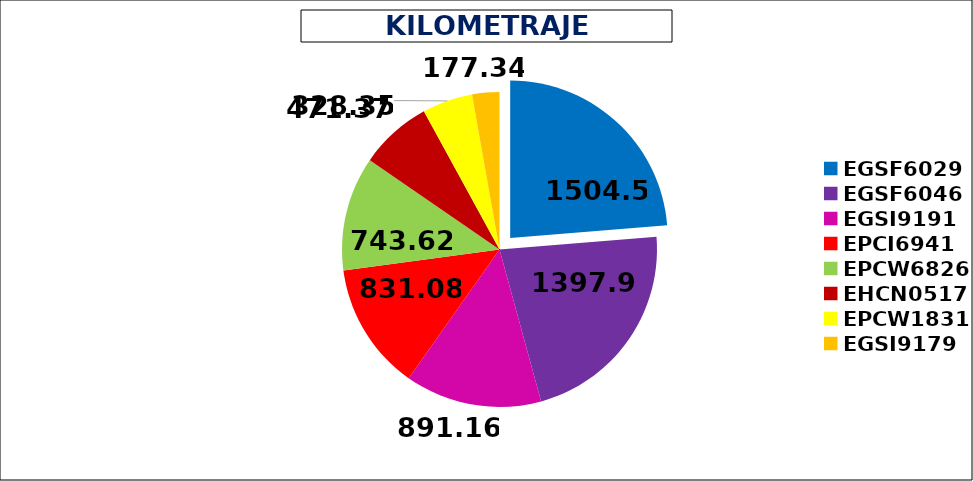
| Category | Total |
|---|---|
| EGSF6029 | 1504.5 |
| EGSF6046 | 1397.94 |
| EGSI9191 | 891.16 |
| EPCI6941 | 831.08 |
| EPCW6826 | 743.62 |
| EHCN0517 | 471.37 |
| EPCW1831 | 328.35 |
| EGSI9179 | 177.34 |